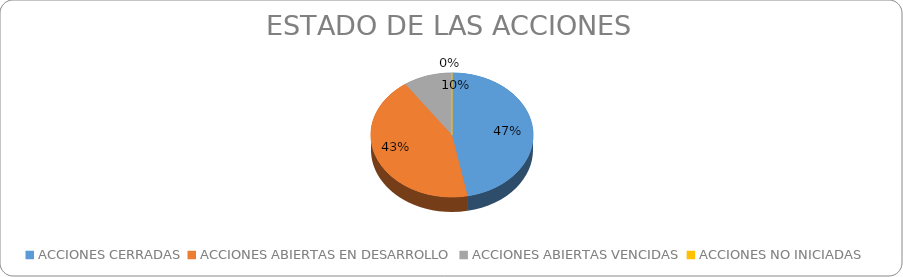
| Category | Series 0 |
|---|---|
| ACCIONES CERRADAS | 53 |
| ACCIONES ABIERTAS EN DESARROLLO | 49 |
| ACCIONES ABIERTAS VENCIDAS | 11 |
| ACCIONES NO INICIADAS | 0 |